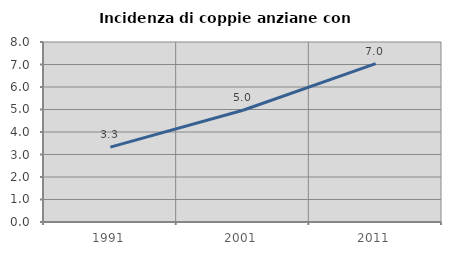
| Category | Incidenza di coppie anziane con figli |
|---|---|
| 1991.0 | 3.329 |
| 2001.0 | 4.965 |
| 2011.0 | 7.039 |